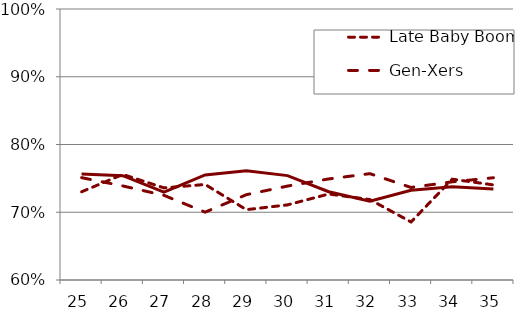
| Category | Late Baby Boomers | Gen-Xers | Millennials |
|---|---|---|---|
| 25.0 | 0.73 | 0.751 | 0.756 |
| 26.0 | 0.756 | 0.739 | 0.754 |
| 27.0 | 0.736 | 0.725 | 0.73 |
| 28.0 | 0.741 | 0.7 | 0.755 |
| 29.0 | 0.704 | 0.726 | 0.761 |
| 30.0 | 0.711 | 0.739 | 0.754 |
| 31.0 | 0.727 | 0.749 | 0.73 |
| 32.0 | 0.719 | 0.757 | 0.716 |
| 33.0 | 0.686 | 0.737 | 0.732 |
| 34.0 | 0.749 | 0.745 | 0.738 |
| 35.0 | 0.74 | 0.751 | 0.734 |